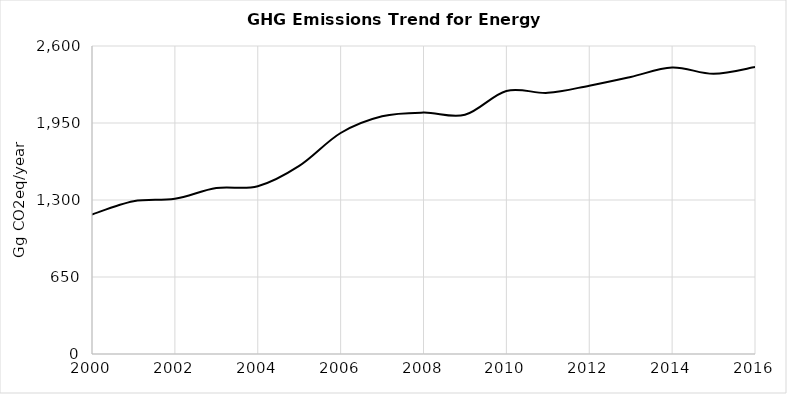
| Category | Series 0 |
|---|---|
| 2000.0 | 1177.612 |
| 2001.0 | 1289.304 |
| 2002.0 | 1310.802 |
| 2003.0 | 1400.799 |
| 2004.0 | 1416.172 |
| 2005.0 | 1587.641 |
| 2006.0 | 1865.46 |
| 2007.0 | 2006.648 |
| 2008.0 | 2037.72 |
| 2009.0 | 2019.239 |
| 2010.0 | 2220.335 |
| 2011.0 | 2204.719 |
| 2012.0 | 2265.144 |
| 2013.0 | 2338.844 |
| 2014.0 | 2418.533 |
| 2015.0 | 2365.055 |
| 2016.0 | 2422.16 |